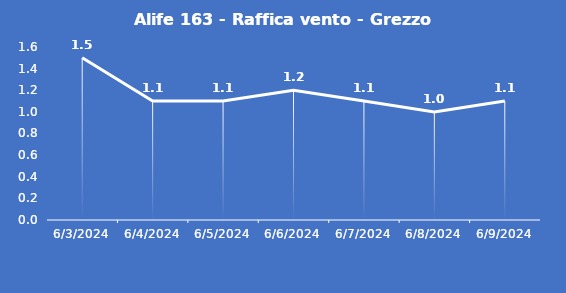
| Category | Alife 163 - Raffica vento - Grezzo (m/s) |
|---|---|
| 6/3/24 | 1.5 |
| 6/4/24 | 1.1 |
| 6/5/24 | 1.1 |
| 6/6/24 | 1.2 |
| 6/7/24 | 1.1 |
| 6/8/24 | 1 |
| 6/9/24 | 1.1 |